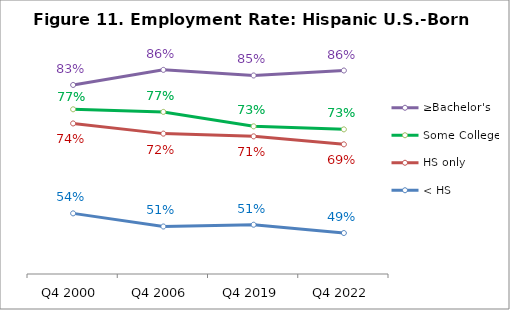
| Category | ≥Bachelor's | Some College | HS only | < HS |
|---|---|---|---|---|
| Q4 2000 | 0.826 | 0.771 | 0.739 | 0.537 |
| Q4 2006 | 0.86 | 0.765 | 0.716 | 0.507 |
| Q4 2019 | 0.847 | 0.733 | 0.71 | 0.511 |
| Q4 2022 | 0.858 | 0.726 | 0.692 | 0.492 |